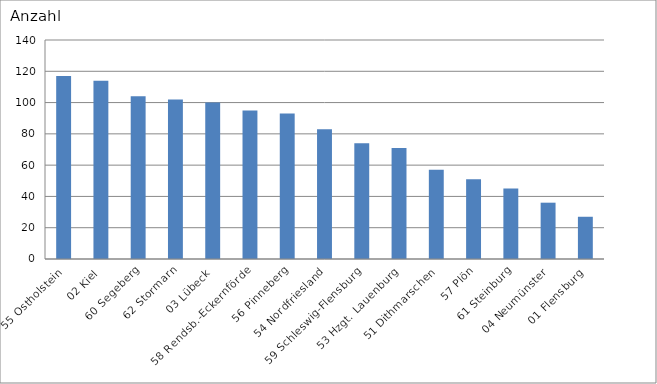
| Category | 55 Ostholstein 02 Kiel 60 Segeberg 62 Stormarn 03 Lübeck 58 Rendsb.-Eckernförde 56 Pinneberg 54 Nordfriesland 59 Schleswig-Flensburg 53 Hzgt. Lauenburg 51 Dithmarschen 57 Plön 61 Steinburg 04 Neumünster 01 Flensburg |
|---|---|
| 55 Ostholstein | 117 |
| 02 Kiel | 114 |
| 60 Segeberg | 104 |
| 62 Stormarn | 102 |
| 03 Lübeck | 100 |
| 58 Rendsb.-Eckernförde | 95 |
| 56 Pinneberg | 93 |
| 54 Nordfriesland | 83 |
| 59 Schleswig-Flensburg | 74 |
| 53 Hzgt. Lauenburg | 71 |
| 51 Dithmarschen | 57 |
| 57 Plön | 51 |
| 61 Steinburg | 45 |
| 04 Neumünster | 36 |
| 01 Flensburg | 27 |